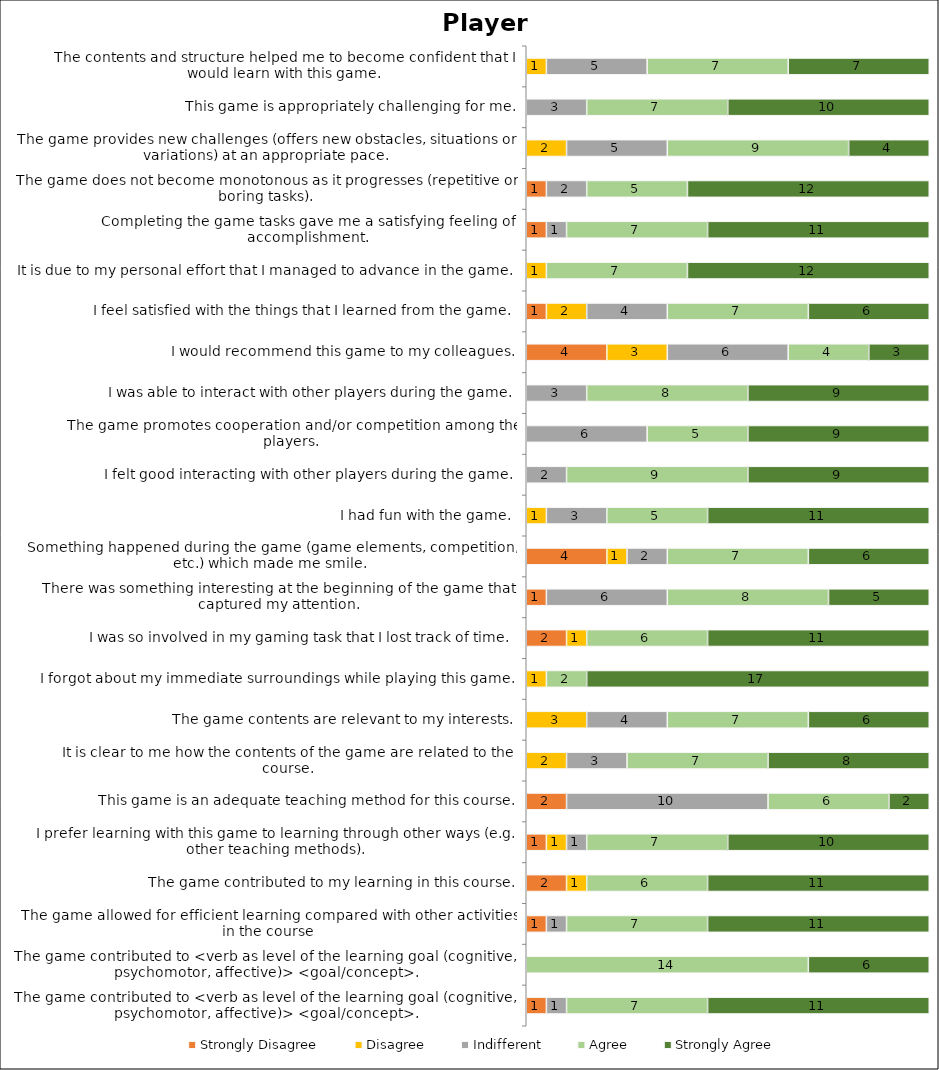
| Category | Strongly Disagree | Disagree | Indifferent | Agree | Strongly Agree |
|---|---|---|---|---|---|
| The contents and structure helped me to become confident that I would learn with this game. | 0 | 1 | 5 | 7 | 7 |
| This game is appropriately challenging for me. | 0 | 0 | 3 | 7 | 10 |
| The game provides new challenges (offers new obstacles, situations or variations) at an appropriate pace. | 0 | 2 | 5 | 9 | 4 |
| The game does not become monotonous as it progresses (repetitive or boring tasks). | 1 | 0 | 2 | 5 | 12 |
| Completing the game tasks gave me a satisfying feeling of accomplishment. | 1 | 0 | 1 | 7 | 11 |
| It is due to my personal effort that I managed to advance in the game. | 0 | 1 | 0 | 7 | 12 |
| I feel satisfied with the things that I learned from the game. | 1 | 2 | 4 | 7 | 6 |
| I would recommend this game to my colleagues. | 4 | 3 | 6 | 4 | 3 |
| I was able to interact with other players during the game. | 0 | 0 | 3 | 8 | 9 |
| The game promotes cooperation and/or competition among the players. | 0 | 0 | 6 | 5 | 9 |
| I felt good interacting with other players during the game. | 0 | 0 | 2 | 9 | 9 |
| I had fun with the game. | 0 | 1 | 3 | 5 | 11 |
| Something happened during the game (game elements, competition, etc.) which made me smile. | 4 | 1 | 2 | 7 | 6 |
| There was something interesting at the beginning of the game that captured my attention. | 1 | 0 | 6 | 8 | 5 |
| I was so involved in my gaming task that I lost track of time. | 2 | 1 | 0 | 6 | 11 |
| I forgot about my immediate surroundings while playing this game. | 0 | 1 | 0 | 2 | 17 |
| The game contents are relevant to my interests. | 0 | 3 | 4 | 7 | 6 |
| It is clear to me how the contents of the game are related to the course. | 0 | 2 | 3 | 7 | 8 |
| This game is an adequate teaching method for this course. | 2 | 0 | 10 | 6 | 2 |
| I prefer learning with this game to learning through other ways (e.g. other teaching methods). | 1 | 1 | 1 | 7 | 10 |
| The game contributed to my learning in this course. | 2 | 1 | 0 | 6 | 11 |
| The game allowed for efficient learning compared with other activities in the course | 1 | 0 | 1 | 7 | 11 |
| The game contributed to <verb as level of the learning goal (cognitive, psychomotor, affective)> <goal/concept>. | 0 | 0 | 0 | 14 | 6 |
| The game contributed to <verb as level of the learning goal (cognitive, psychomotor, affective)> <goal/concept>. | 1 | 0 | 1 | 7 | 11 |